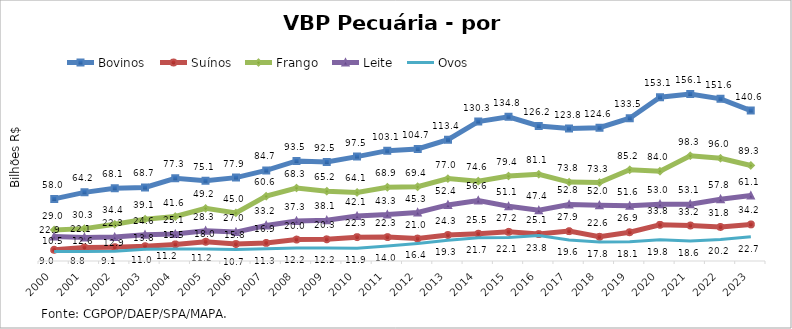
| Category | Bovinos | Suínos | Frango | Leite | Ovos |
|---|---|---|---|---|---|
| 2000 | 58.034 | 10.508 | 28.989 | 22.923 | 8.963 |
| 2001 | 64.152 | 12.607 | 30.253 | 22.058 | 8.832 |
| 2002 | 68.077 | 12.921 | 34.355 | 22.336 | 9.099 |
| 2003 | 68.707 | 13.809 | 39.11 | 24.597 | 11.007 |
| 2004 | 77.304 | 15.526 | 41.555 | 25.139 | 11.156 |
| 2005 | 75.051 | 18.001 | 49.183 | 28.274 | 11.231 |
| 2006 | 77.921 | 15.834 | 44.996 | 27.007 | 10.669 |
| 2007 | 84.683 | 16.932 | 60.582 | 33.201 | 11.339 |
| 2008 | 93.5 | 20.049 | 68.258 | 37.349 | 12.245 |
| 2009 | 92.524 | 20.266 | 65.247 | 38.078 | 12.21 |
| 2010 | 97.549 | 22.295 | 64.074 | 42.051 | 11.875 |
| 2011 | 103.124 | 22.33 | 68.919 | 43.35 | 13.993 |
| 2012 | 104.661 | 20.967 | 69.405 | 45.299 | 16.403 |
| 2013 | 113.416 | 24.276 | 77 | 52.42 | 19.292 |
| 2014 | 130.294 | 25.498 | 74.636 | 56.607 | 21.676 |
| 2015 | 134.778 | 27.249 | 79.446 | 51.097 | 22.07 |
| 2016 | 126.159 | 25.147 | 81.085 | 47.412 | 23.793 |
| 2017 | 123.803 | 27.916 | 73.751 | 52.827 | 19.612 |
| 2018 | 124.633 | 22.608 | 73.321 | 52.042 | 17.834 |
| 2019 | 133.454 | 26.872 | 85.232 | 51.559 | 18.061 |
| 2020 | 153.08 | 33.778 | 83.954 | 53.01 | 19.835 |
| 2021 | 156.101 | 33.176 | 98.314 | 53.069 | 18.587 |
| 2022 | 151.579 | 31.828 | 96.033 | 57.785 | 20.171 |
| 2023 | 140.609 | 34.186 | 89.299 | 61.12 | 22.729 |